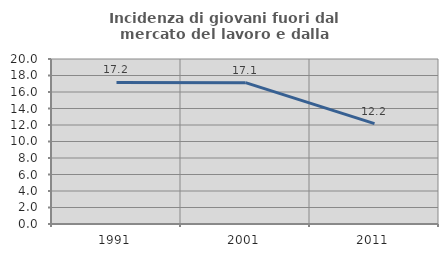
| Category | Incidenza di giovani fuori dal mercato del lavoro e dalla formazione  |
|---|---|
| 1991.0 | 17.164 |
| 2001.0 | 17.128 |
| 2011.0 | 12.16 |